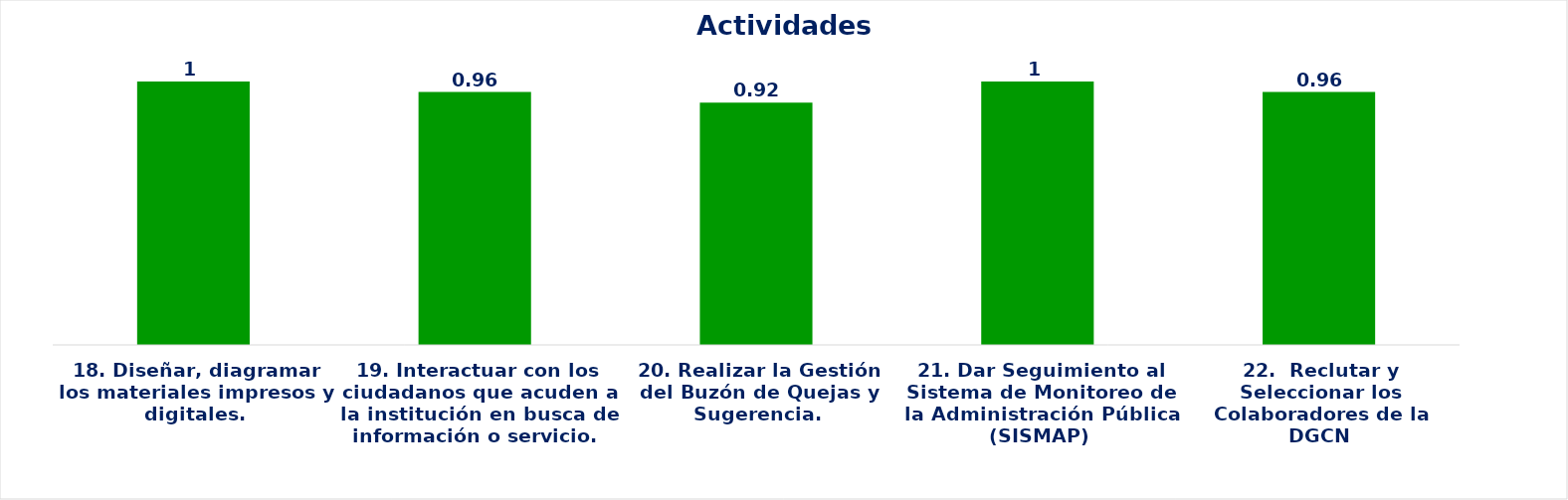
| Category | Series 0 |
|---|---|
| 18. Diseñar, diagramar los materiales impresos y digitales. | 1 |
| 19. Interactuar con los ciudadanos que acuden a la institución en busca de información o servicio.  | 0.96 |
| 20. Realizar la Gestión del Buzón de Quejas y Sugerencia. | 0.92 |
| 21. Dar Seguimiento al Sistema de Monitoreo de la Administración Pública (SISMAP) | 1 |
| 22.  Reclutar y Seleccionar los Colaboradores de la DGCN | 0.96 |